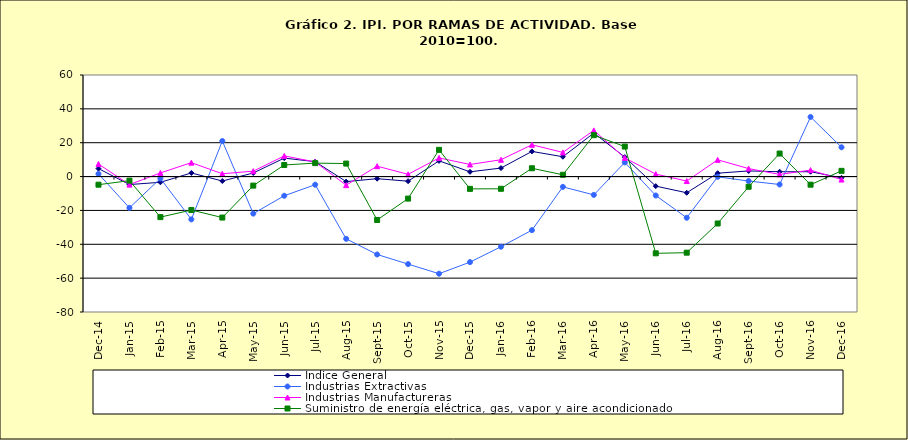
| Category | Índice General | Industrias Extractivas | Industrias Manufactureras | Suministro de energía eléctrica, gas, vapor y aire acondicionado |
|---|---|---|---|---|
| 2014-12-03 | 4.714 | 1.6 | 7.414 | -4.798 |
| 2015-01-01 | -4.714 | -18.484 | -4.754 | -2.399 |
| 2015-02-02 | -3.374 | -1.114 | 2.155 | -23.948 |
| 2015-03-03 | 2.131 | -25.288 | 8.22 | -19.779 |
| 2015-04-04 | -2.63 | 21.001 | 1.659 | -24.209 |
| 2015-05-05 | 2.125 | -21.891 | 3.207 | -5.337 |
| 2015-06-06 | 10.902 | -11.334 | 12.206 | 6.846 |
| 2015-07-07 | 8.793 | -4.808 | 8.659 | 7.949 |
| 2015-08-08 | -2.962 | -36.79 | -5.077 | 7.676 |
| 2015-09-09 | -1.256 | -46.021 | 6.14 | -25.63 |
| 2015-10-10 | -2.727 | -51.697 | 1.328 | -13.016 |
| 2015-11-01 | 9.284 | -57.382 | 11.015 | 15.787 |
| 2015-12-02 | 2.805 | -50.53 | 7.149 | -7.264 |
| 2016-01-01 | 5.027 | -41.452 | 9.94 | -7.213 |
| 2016-02-02 | 14.862 | -31.659 | 18.791 | 4.905 |
| 2016-03-03 | 11.716 | -6.084 | 14.271 | 1.051 |
| 2016-04-04 | 25.706 | -10.827 | 27.293 | 24.454 |
| 2016-05-05 | 11.507 | 8.368 | 11.02 | 17.722 |
| 2016-06-06 | -5.65 | -11.184 | 1.48 | -45.341 |
| 2016-07-07 | -9.559 | -24.327 | -2.652 | -44.958 |
| 2016-08-08 | 1.995 | -0.156 | 9.894 | -27.718 |
| 2016-09-09 | 3.335 | -2.622 | 4.72 | -6.015 |
| 2016-10-10 | 2.852 | -4.681 | 1.275 | 13.603 |
| 2016-11-11 | 2.857 | 35.212 | 3.824 | -4.801 |
| 2016-12-12 | -0.722 | 17.295 | -1.76 | 3.382 |